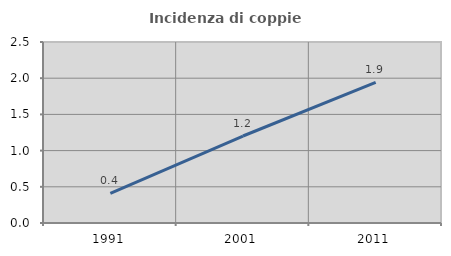
| Category | Incidenza di coppie miste |
|---|---|
| 1991.0 | 0.41 |
| 2001.0 | 1.202 |
| 2011.0 | 1.943 |